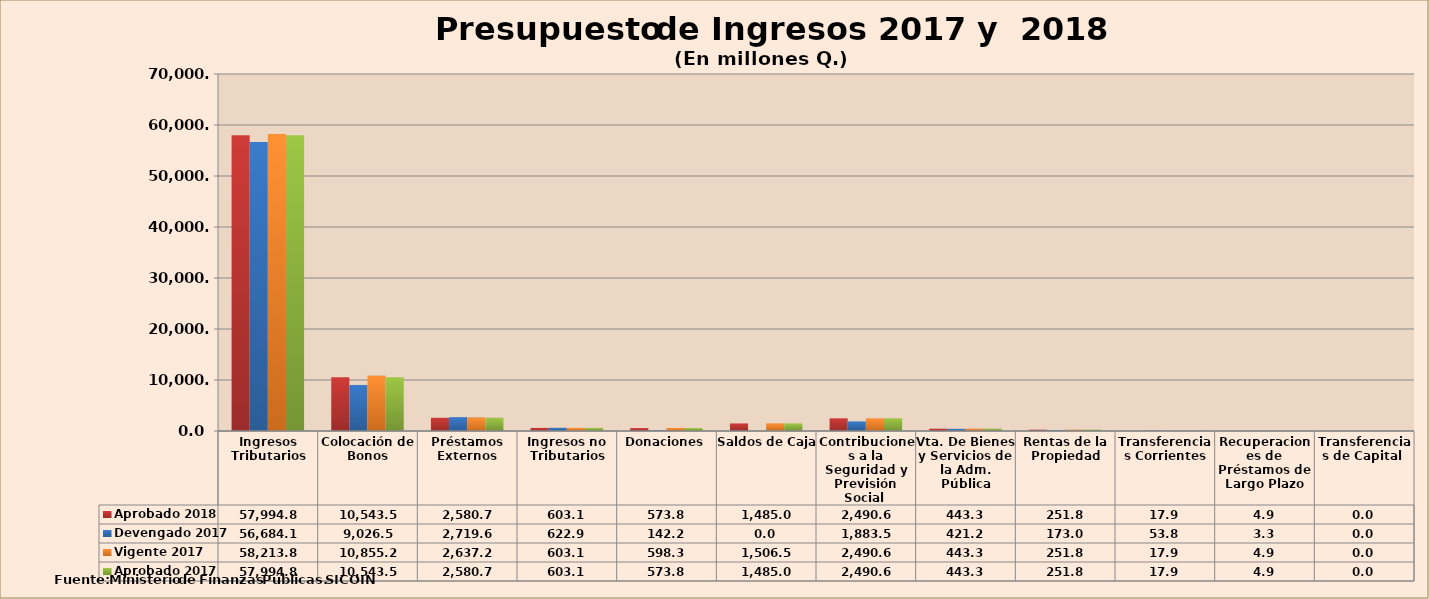
| Category | Aprobado 2018 | Devengado 2017 | Vigente 2017 | Aprobado 2017 |
|---|---|---|---|---|
| Ingresos Tributarios | 57994.8 | 56684.1 | 58213.8 | 57994.8 |
| Colocación de Bonos | 10543.5 | 9026.5 | 10855.2 | 10543.5 |
| Préstamos Externos | 2580.7 | 2719.6 | 2637.2 | 2580.7 |
| Ingresos no Tributarios | 603.1 | 622.9 | 603.1 | 603.1 |
| Donaciones | 573.8 | 142.2 | 598.3 | 573.8 |
| Saldos de Caja | 1485 | 0 | 1506.5 | 1485 |
| Contribuciones a la Seguridad y Previsión Social  | 2490.6 | 1883.5 | 2490.6 | 2490.6 |
| Vta. De Bienes y Servicios de la Adm. Pública | 443.3 | 421.2 | 443.3 | 443.3 |
| Rentas de la Propiedad | 251.8 | 173 | 251.8 | 251.8 |
| Transferencias Corrientes | 17.9 | 53.8 | 17.9 | 17.9 |
| Recuperaciones de Préstamos de Largo Plazo | 4.9 | 3.3 | 4.9 | 4.9 |
| Transferencias de Capital  | 0 | 0 | 0 | 0 |